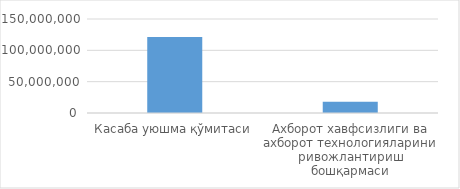
| Category | Товар / хизматнинг
жами суммаси
(cумда) 
(ҚҚС билан) |
|---|---|
| Касаба уюшма қўмитаси | 121300000 |
| Ахборот хавфсизлиги ва ахборот технологияларини ривожлантириш бошқармаси | 18000000 |